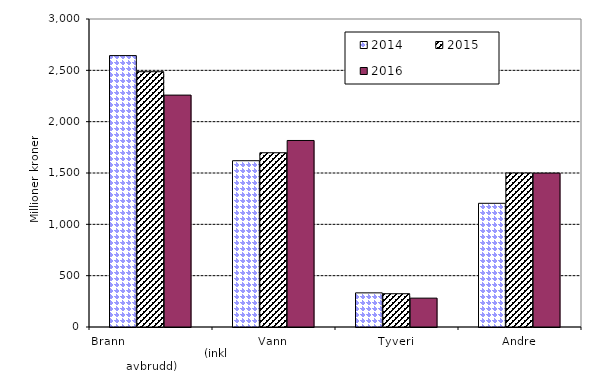
| Category | 2014 | 2015 | 2016 |
|---|---|---|---|
| Brann                                                       (inkl avbrudd) | 2643.683 | 2486.577 | 2258.695 |
| Vann | 1619.639 | 1697.321 | 1816.834 |
| Tyveri | 332.484 | 324.222 | 281.208 |
| Andre | 1204.755 | 1500.007 | 1499.083 |